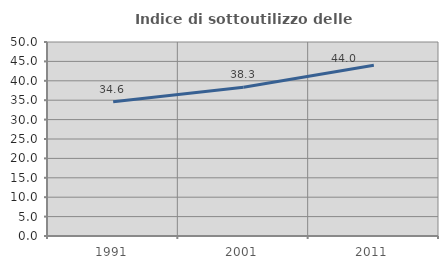
| Category | Indice di sottoutilizzo delle abitazioni  |
|---|---|
| 1991.0 | 34.62 |
| 2001.0 | 38.34 |
| 2011.0 | 43.992 |